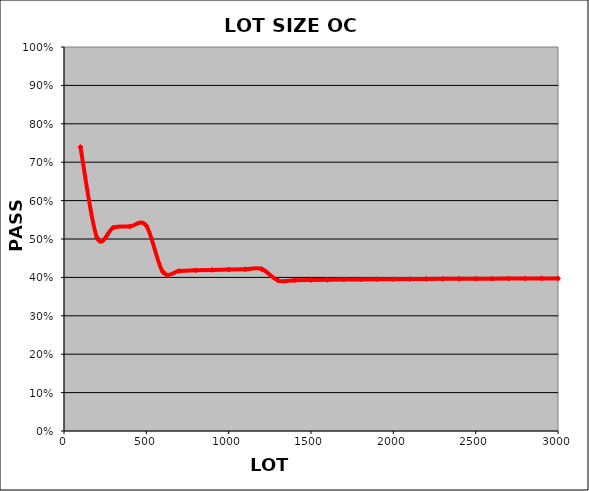
| Category | PASS
RATE |
|---|---|
| 100.0 | 0.739 |
| 200.0 | 0.504 |
| 300.0 | 0.53 |
| 400.0 | 0.533 |
| 500.0 | 0.534 |
| 600.0 | 0.415 |
| 700.0 | 0.417 |
| 800.0 | 0.418 |
| 900.0 | 0.42 |
| 1000.0 | 0.42 |
| 1100.0 | 0.421 |
| 1200.0 | 0.422 |
| 1300.0 | 0.392 |
| 1400.0 | 0.393 |
| 1500.0 | 0.393 |
| 1600.0 | 0.394 |
| 1700.0 | 0.394 |
| 1800.0 | 0.395 |
| 1900.0 | 0.395 |
| 2000.0 | 0.395 |
| 2100.0 | 0.396 |
| 2200.0 | 0.396 |
| 2300.0 | 0.396 |
| 2400.0 | 0.396 |
| 2500.0 | 0.397 |
| 2600.0 | 0.397 |
| 2700.0 | 0.397 |
| 2800.0 | 0.397 |
| 2900.0 | 0.397 |
| 3000.0 | 0.397 |